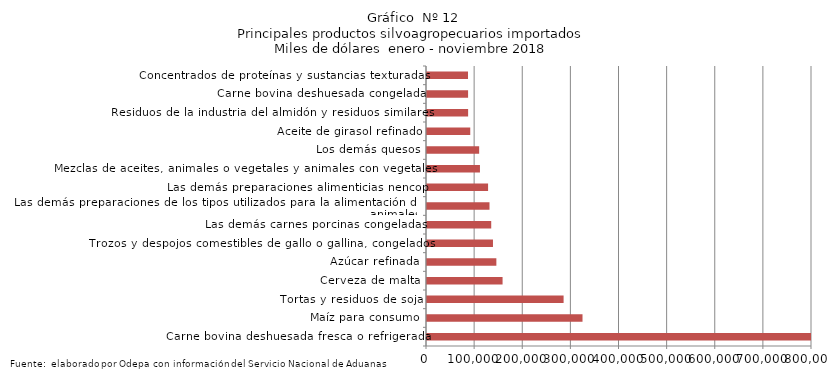
| Category | Series 0 |
|---|---|
| Carne bovina deshuesada fresca o refrigerada | 804331.207 |
| Maíz para consumo | 323145.78 |
| Tortas y residuos de soja | 283834.979 |
| Cerveza de malta | 157033.305 |
| Azúcar refinada | 144134.586 |
| Trozos y despojos comestibles de gallo o gallina, congelados | 137086.574 |
| Las demás carnes porcinas congeladas | 133452.708 |
| Las demás preparaciones de los tipos utilizados para la alimentación de los animales | 129858.269 |
| Las demás preparaciones alimenticias nencop | 126918.4 |
| Mezclas de aceites, animales o vegetales y animales con vegetales | 110028.187 |
| Los demás quesos | 108387.721 |
| Aceite de girasol refinado | 89863.25 |
| Residuos de la industria del almidón y residuos similares | 85454.446 |
| Carne bovina deshuesada congelada | 85369.478 |
| Concentrados de proteínas y sustancias texturadas | 85207.966 |